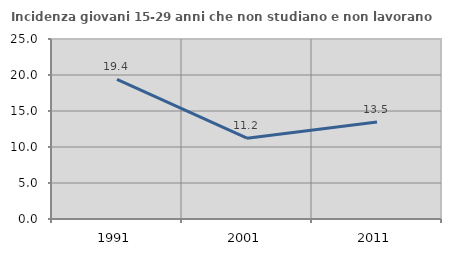
| Category | Incidenza giovani 15-29 anni che non studiano e non lavorano  |
|---|---|
| 1991.0 | 19.403 |
| 2001.0 | 11.224 |
| 2011.0 | 13.462 |